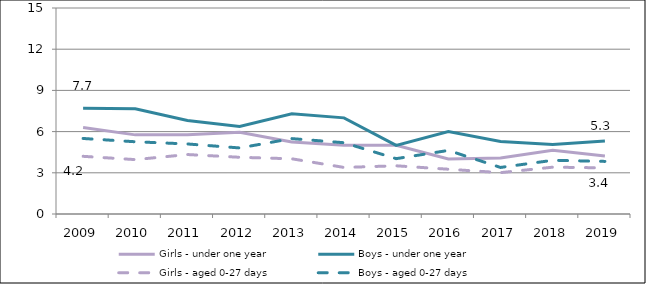
| Category | Girls - under one year | Boys - under one year | Girls - aged 0-27 days | Boys - aged 0-27 days |
|---|---|---|---|---|
| 2009.0 | 6.3 | 7.7 | 4.2 | 5.5 |
| 2010.0 | 5.762 | 7.661 | 3.96 | 5.26 |
| 2011.0 | 5.779 | 6.808 | 4.33 | 5.1 |
| 2012.0 | 5.959 | 6.371 | 4.13 | 4.81 |
| 2013.0 | 5.244 | 7.298 | 4.02 | 5.49 |
| 2014.0 | 5 | 7 | 3.39 | 5.19 |
| 2015.0 | 5 | 5 | 3.51 | 4.03 |
| 2016.0 | 4 | 6 | 3.26 | 4.63 |
| 2017.0 | 4.086 | 5.282 | 3.01 | 3.39 |
| 2018.0 | 4.648 | 5.059 | 3.41 | 3.91 |
| 2019.0 | 4.222 | 5.311 | 3.36 | 3.83 |